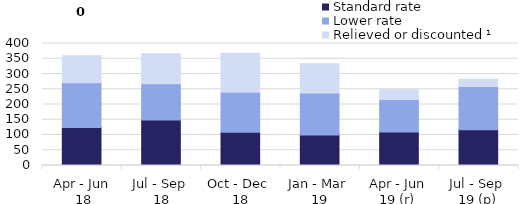
| Category | Standard rate | Lower rate | Relieved or discounted ¹ |
|---|---|---|---|
| Apr - Jun
 18 | 125 | 146 | 89 |
| Jul - Sep 
18 | 149 | 119 | 98 |
| Oct - Dec 
18 | 109 | 131 | 128 |
| Jan - Mar 
19 | 100 | 138 | 96 |
| Apr - Jun 
19 (r)  | 110 | 106 | 32 |
| Jul - Sep 
19 (p) | 117 | 142 | 24 |